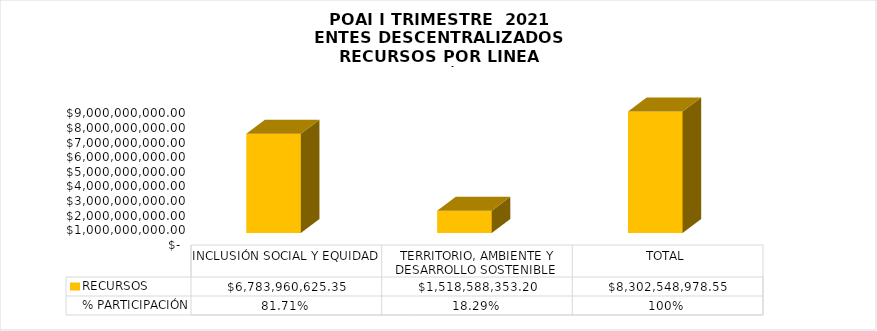
| Category | RECURSOS | % PARTICIPACIÓN |
|---|---|---|
| INCLUSIÓN SOCIAL Y EQUIDAD  | 6783960625.35 | 0.817 |
| TERRITORIO, AMBIENTE Y DESARROLLO SOSTENIBLE  | 1518588353.2 | 0.183 |
| TOTAL | 8302548978.55 | 1 |